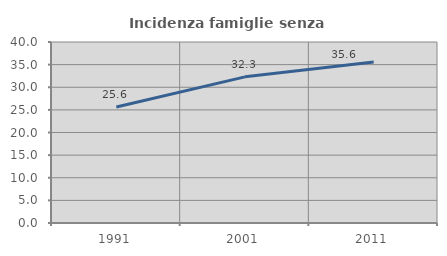
| Category | Incidenza famiglie senza nuclei |
|---|---|
| 1991.0 | 25.632 |
| 2001.0 | 32.299 |
| 2011.0 | 35.602 |